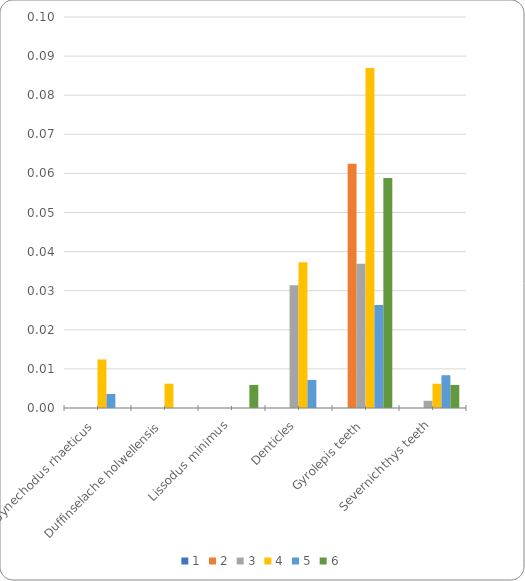
| Category | 1 | 2 | 3 | 4 | 5 | 6 |
|---|---|---|---|---|---|---|
| Synechodus rhaeticus  | 0 | 0 | 0 | 0.012 | 0.004 | 0 |
| Duffinselache holwellensis | 0 | 0 | 0 | 0.006 | 0 | 0 |
| Lissodus minimus | 0 | 0 | 0 | 0 | 0 | 0.006 |
| Denticles | 0 | 0 | 0.031 | 0.037 | 0.007 | 0 |
| Gyrolepis teeth | 0 | 0.062 | 0.037 | 0.087 | 0.026 | 0.059 |
| Severnichthys teeth | 0 | 0 | 0.002 | 0.006 | 0.008 | 0.006 |